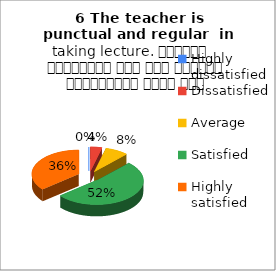
| Category | 6 The teacher is punctual and regular  in taking lecture. शिक्षक समयनिष्ठ हैं एवं नियमित व्याख्यान देते हैं |
|---|---|
| Highly dissatisfied | 0 |
| Dissatisfied | 1 |
| Average | 2 |
| Satisfied | 13 |
| Highly satisfied | 9 |